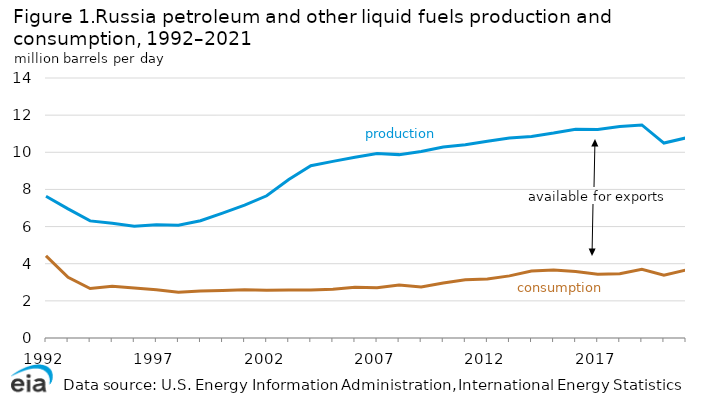
| Category | Production | Consumption |
|---|---|---|
| 1992.0 | 7.632 | 4.424 |
| 1993.0 | 6.951 | 3.272 |
| 1994.0 | 6.307 | 2.661 |
| 1995.0 | 6.173 | 2.782 |
| 1996.0 | 6.017 | 2.696 |
| 1997.0 | 6.101 | 2.594 |
| 1998.0 | 6.07 | 2.463 |
| 1999.0 | 6.312 | 2.537 |
| 2000.0 | 6.724 | 2.564 |
| 2001.0 | 7.16 | 2.601 |
| 2002.0 | 7.659 | 2.576 |
| 2003.0 | 8.535 | 2.59 |
| 2004.0 | 9.274 | 2.584 |
| 2005.0 | 9.511 | 2.62 |
| 2006.0 | 9.732 | 2.727 |
| 2007.0 | 9.938 | 2.711 |
| 2008.0 | 9.874 | 2.847 |
| 2009.0 | 10.047 | 2.749 |
| 2010.0 | 10.288 | 2.966 |
| 2011.0 | 10.409 | 3.131 |
| 2012.0 | 10.596 | 3.179 |
| 2013.0 | 10.766 | 3.346 |
| 2014.0 | 10.853 | 3.607 |
| 2015.0 | 11.035 | 3.659 |
| 2016.0 | 11.245 | 3.577 |
| 2017.0 | 11.231 | 3.427 |
| 2018.0 | 11.385 | 3.463 |
| 2019.0 | 11.474 | 3.699 |
| 2020.0 | 10.496 | 3.376 |
| 2021.0 | 10.777 | 3.665 |